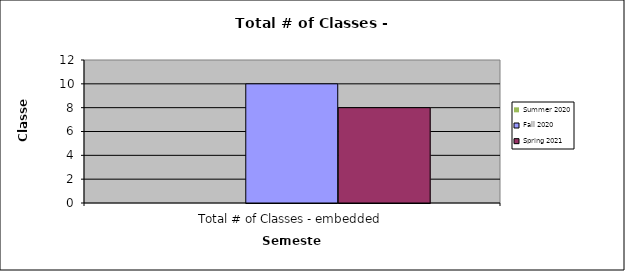
| Category | Summer 2020 | Fall 2020 | Spring 2021 |
|---|---|---|---|
| Total # of Classes - embedded | 0 | 10 | 8 |